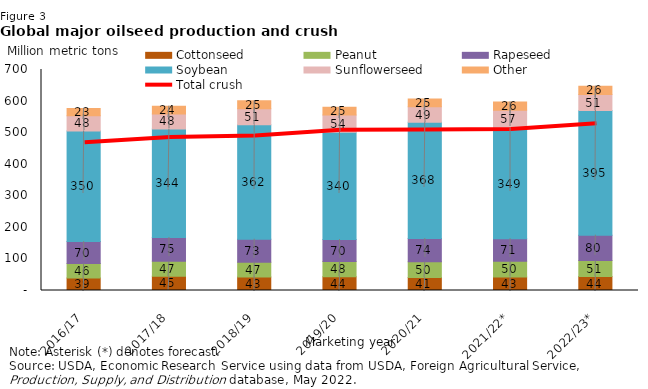
| Category | Cottonseed | Peanut | Rapeseed | Soybean | Sunflowerseed | Other |
|---|---|---|---|---|---|---|
| 2016/17 | 39.287 | 45.97 | 69.554 | 350.388 | 48.393 | 22.657 |
| 2017/18 | 45.252 | 47.152 | 75.283 | 343.735 | 48.01 | 24.463 |
| 2018/19 | 42.97 | 46.709 | 72.853 | 362.443 | 50.659 | 25.28 |
| 2019/20 | 43.547 | 48.136 | 69.598 | 340.152 | 54.2 | 25.018 |
| 2020/21 | 40.806 | 50.248 | 73.593 | 368.122 | 49.249 | 24.623 |
| 2021/22* | 42.747 | 50.287 | 71.179 | 349.367 | 57.379 | 25.91 |
| 2022/23* | 44.074 | 50.914 | 80.32 | 394.693 | 50.722 | 26.422 |